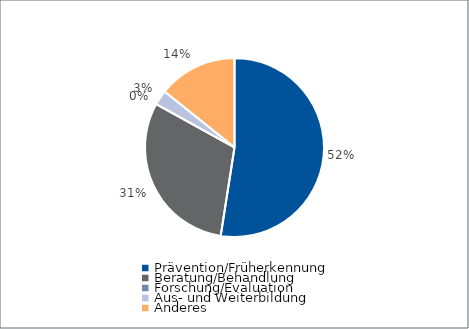
| Category | Series 0 |
|---|---|
| Prävention/Früherkennung | 4800 |
| Beratung/Behandlung | 2799 |
| Forschung/Evaluation | 0 |
| Aus- und Weiterbildung | 246 |
| Anderes | 1304 |